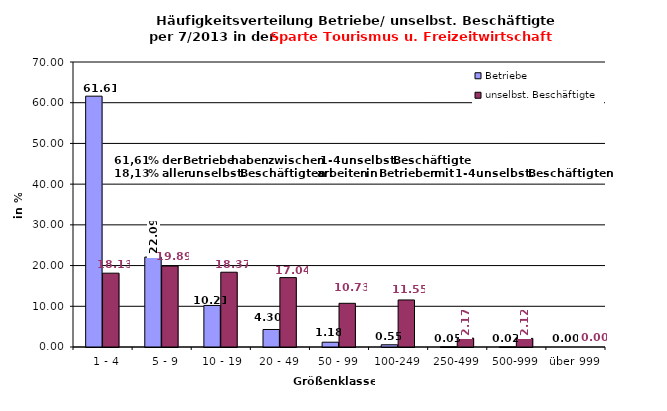
| Category | Betriebe | unselbst. Beschäftigte |
|---|---|---|
|   1 - 4 | 61.608 | 18.131 |
|   5 - 9 | 22.089 | 19.886 |
|  10 - 19 | 10.208 | 18.367 |
| 20 - 49 | 4.302 | 17.04 |
| 50 - 99 | 1.178 | 10.732 |
| 100-249 | 0.546 | 11.554 |
| 250-499 | 0.051 | 2.173 |
| 500-999 | 0.017 | 2.117 |
| über 999 | 0 | 0 |